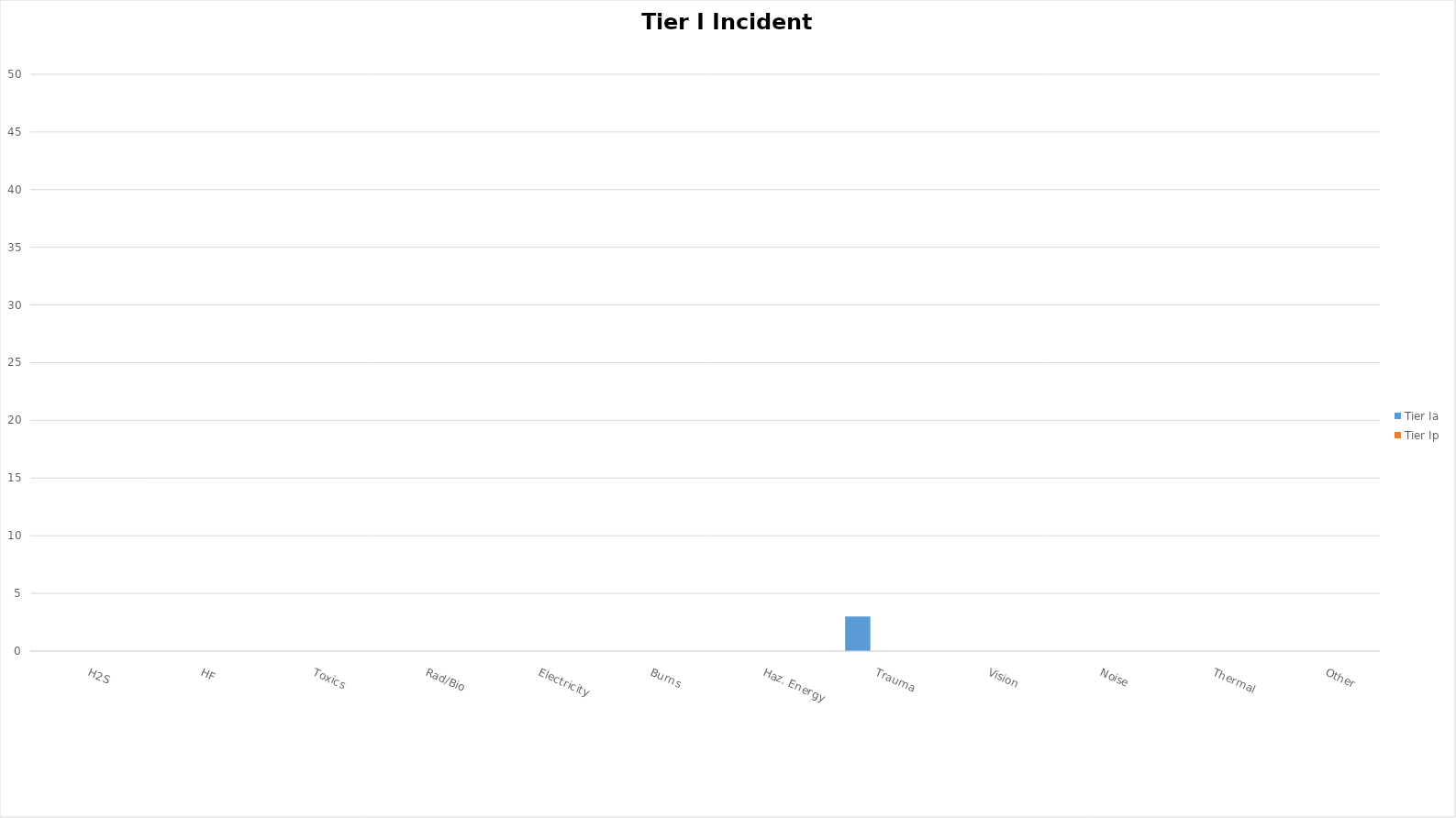
| Category | Tier Ia | Tier Ip |
|---|---|---|
| H2S | 0 | 0 |
| HF | 0 | 0 |
| Toxics | 0 | 0 |
| Rad/Bio | 0 | 0 |
| Electricity | 0 | 0 |
| Burns | 0 | 0 |
| Haz. Energy | 0 | 0 |
| Trauma | 3 | 0 |
| Vision | 0 | 0 |
| Noise | 0 | 0 |
| Thermal | 0 | 0 |
| Other | 0 | 0 |